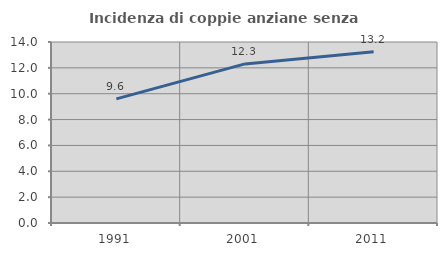
| Category | Incidenza di coppie anziane senza figli  |
|---|---|
| 1991.0 | 9.603 |
| 2001.0 | 12.304 |
| 2011.0 | 13.243 |